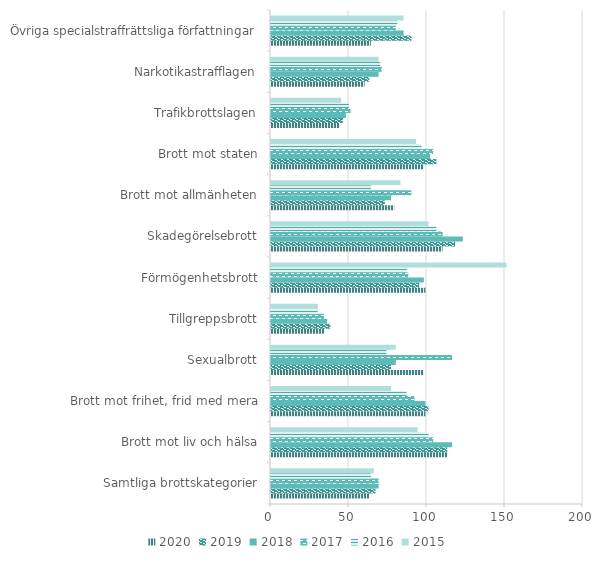
| Category | 2020 | 2019 | 2018 | 2017 | 2016 | 2015 |
|---|---|---|---|---|---|---|
| Samtliga brottskategorier | 63 | 67 | 69 | 69 | 64 | 66 |
| Brott mot liv och hälsa | 113 | 113 | 116 | 104 | 101 | 94 |
| Brott mot frihet, frid med mera | 99 | 101 | 99 | 92 | 87 | 77 |
| Sexualbrott | 98 | 77 | 80 | 116 | 74 | 80 |
| Tillgreppsbrott | 34 | 38 | 36 | 34 | 30 | 30 |
| Förmögenhetsbrott | 99 | 95 | 98 | 88 | 87 | 151 |
| Skadegörelsebrott | 110 | 118 | 123 | 110 | 106 | 101 |
| Brott mot allmänheten | 79 | 73 | 77 | 90 | 64 | 83 |
| Brott mot staten | 98 | 106 | 102 | 104 | 96.5 | 93 |
| Trafikbrottslagen | 44 | 46 | 48 | 51 | 50 | 45 |
| Narkotikastrafflagen | 60 | 63 | 69 | 71 | 70 | 69 |
| Övriga specialstraffrättsliga författningar | 64 | 90 | 85 | 80 | 81 | 85 |